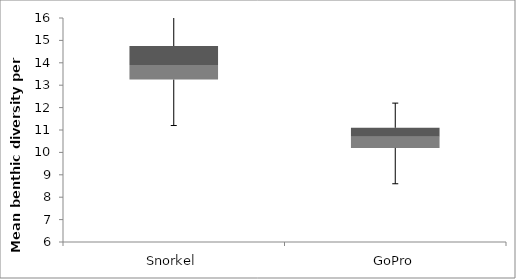
| Category | Min | Q1-Min | Med-Q1 | Q3-Med |
|---|---|---|---|---|
| Snorkel | 11.2 | 2.05 | 0.65 | 0.85 |
| GoPro | 8.6 | 1.6 | 0.5 | 0.4 |